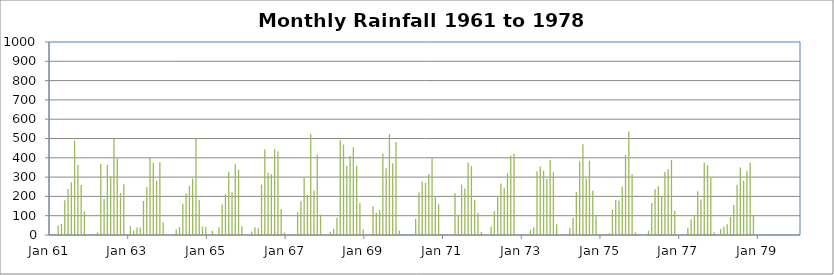
| Category | Monthly Rainfall |
|---|---|
| 1921-01-31 | 0 |
| 1921-02-28 | 0 |
| 1921-03-31 | 140.5 |
| 1921-04-30 | 119.6 |
| 1921-05-31 | 381.8 |
| 1921-06-30 | 167.4 |
| 1921-07-31 | 311.7 |
| 1921-08-31 | 283.7 |
| 1921-09-30 | 272.5 |
| 1921-10-31 | 304.5 |
| 1921-11-30 | 108.5 |
| 1921-12-31 | 76.2 |
| 1922-01-31 | 0 |
| 1922-02-28 | 0 |
| 1922-03-31 | 45.7 |
| 1922-04-30 | 85.1 |
| 1922-05-31 | 345.4 |
| 1922-06-30 | 569.2 |
| 1922-07-31 | 336.5 |
| 1922-08-31 | 350.5 |
| 1922-09-30 | 463 |
| 1922-10-31 | 261.1 |
| 1922-11-30 | 127 |
| 1922-12-31 | 52.1 |
| 1923-01-31 | 0 |
| 1923-02-28 | 0 |
| 1923-03-31 | 76.2 |
| 1923-04-30 | 122.7 |
| 1923-05-31 | 138.2 |
| 1923-06-30 | 397.5 |
| 1923-07-31 | 357.6 |
| 1923-08-31 | 302.3 |
| 1923-09-30 | 463.3 |
| 1923-10-31 | 325.9 |
| 1923-11-30 | 277.1 |
| 1923-12-31 | 39.6 |
| 1924-01-31 | 8.1 |
| 1924-02-29 | 72.4 |
| 1924-03-31 | 7.9 |
| 1924-04-30 | 55.9 |
| 1924-05-31 | 238.5 |
| 1924-06-30 | 350.5 |
| 1924-07-31 | 320.3 |
| 1924-08-31 | 378.7 |
| 1924-09-30 | 434.3 |
| 1924-10-31 | 290.1 |
| 1924-11-30 | 180.1 |
| 1924-12-31 | 0 |
| 1925-01-31 | 0 |
| 1925-02-28 | 19.6 |
| 1925-03-31 | 99.3 |
| 1925-04-30 | 37.1 |
| 1925-05-31 | 230.6 |
| 1925-06-30 | 401.1 |
| 1925-07-31 | 271 |
| 1925-08-31 | 284.7 |
| 1925-09-30 | 363.5 |
| 1925-10-31 | 458 |
| 1925-11-30 | 146.3 |
| 1925-12-31 | 27.4 |
| 1926-01-31 | 2.8 |
| 1926-02-28 | 0 |
| 1926-03-31 | 29.7 |
| 1926-04-30 | 42.2 |
| 1926-05-31 | 157.2 |
| 1926-06-30 | 255.3 |
| 1926-07-31 | 347.5 |
| 1926-08-31 | 441.5 |
| 1926-09-30 | 481.8 |
| 1926-10-31 | 265.4 |
| 1926-11-30 | 146.3 |
| 1926-12-31 | 10.2 |
| 1927-01-31 | 0 |
| 1927-02-28 | 2.8 |
| 1927-03-31 | 19.8 |
| 1927-04-30 | 113.8 |
| 1927-05-31 | 272.5 |
| 1927-06-30 | 364 |
| 1927-07-31 | 229.9 |
| 1927-08-31 | 204.5 |
| 1927-09-30 | 531.6 |
| 1927-10-31 | 509.5 |
| 1927-11-30 | 26.7 |
| 1927-12-31 | 9.7 |
| 1928-01-31 | 8.9 |
| 1928-02-29 | 0 |
| 1928-03-31 | 54.6 |
| 1928-04-30 | 232.9 |
| 1928-05-31 | 168.4 |
| 1928-06-30 | 184.4 |
| 1928-07-31 | 496.6 |
| 1928-08-31 | 366 |
| 1928-09-30 | 399.8 |
| 1928-10-31 | 527.8 |
| 1928-11-30 | 53.8 |
| 1928-12-31 | 16.8 |
| 1929-01-31 | 0 |
| 1929-02-28 | 0 |
| 1929-03-31 | 112.8 |
| 1929-04-30 | 110.5 |
| 1929-05-31 | 167.9 |
| 1929-06-30 | 305.3 |
| 1929-07-31 | 237.7 |
| 1929-08-31 | 353.3 |
| 1929-09-30 | 371.3 |
| 1929-10-31 | 319.8 |
| 1929-11-30 | 9.9 |
| 1929-12-31 | 0 |
| 1930-01-31 | 31 |
| 1930-02-28 | 61 |
| 1930-03-31 | 17.8 |
| 1930-04-30 | 45 |
| 1930-05-31 | 180.3 |
| 1930-06-30 | 252.7 |
| 1930-07-31 | 388.6 |
| 1930-08-31 | 316.5 |
| 1930-09-30 | 422.7 |
| 1930-10-31 | 287 |
| 1930-11-30 | 38.4 |
| 1930-12-31 | 17 |
| 1931-01-31 | 37.3 |
| 1931-02-28 | 0 |
| 1931-03-31 | 61 |
| 1931-04-30 | 177.8 |
| 1931-05-31 | 184.9 |
| 1931-06-30 | 418.3 |
| 1931-07-31 | 386.1 |
| 1931-08-31 | 289.3 |
| 1931-09-30 | 294.4 |
| 1931-10-31 | 289.1 |
| 1931-11-30 | 93 |
| 1931-12-31 | 10.9 |
| 1932-01-31 | 0 |
| 1932-02-29 | 29.5 |
| 1932-03-31 | 124 |
| 1932-04-30 | 194.1 |
| 1932-05-31 | 164.3 |
| 1932-06-30 | 410.2 |
| 1932-07-31 | 385.3 |
| 1932-08-31 | 422.1 |
| 1932-09-30 | 308.4 |
| 1932-10-31 | 355.9 |
| 1932-11-30 | 241.6 |
| 1932-12-31 | 0 |
| 1933-01-31 | 1 |
| 1933-02-28 | 87.6 |
| 1933-03-31 | 23.4 |
| 1933-04-30 | 96 |
| 1933-05-31 | 198.4 |
| 1933-06-30 | 358.6 |
| 1933-07-31 | 385.8 |
| 1933-08-31 | 644.1 |
| 1933-09-30 | 308.4 |
| 1933-10-31 | 172 |
| 1933-11-30 | 120.9 |
| 1933-12-31 | 33.8 |
| 1934-01-31 | 0 |
| 1934-02-28 | 39.1 |
| 1934-03-31 | 57.4 |
| 1934-04-30 | 48.5 |
| 1934-05-31 | 35.8 |
| 1934-06-30 | 322.1 |
| 1934-07-31 | 328.2 |
| 1934-08-31 | 442.7 |
| 1934-09-30 | 553.5 |
| 1934-10-31 | 508.3 |
| 1934-11-30 | 37.4 |
| 1934-12-31 | 1 |
| 1935-01-31 | 17.3 |
| 1935-02-28 | 1 |
| 1935-03-31 | 1.8 |
| 1935-04-30 | 34.3 |
| 1935-05-31 | 185.7 |
| 1935-06-30 | 428.2 |
| 1935-07-31 | 351.5 |
| 1935-08-31 | 245.1 |
| 1935-09-30 | 330.7 |
| 1935-10-31 | 254.5 |
| 1935-11-30 | 106.4 |
| 1935-12-31 | 53.1 |
| 1936-01-31 | 5.6 |
| 1936-02-29 | 9.4 |
| 1936-03-31 | 47.2 |
| 1936-04-30 | 90.9 |
| 1936-05-31 | 233.7 |
| 1936-06-30 | 278.9 |
| 1936-07-31 | 309.6 |
| 1936-08-31 | 351 |
| 1936-09-30 | 392.9 |
| 1936-10-31 | 326.9 |
| 1936-11-30 | 91.2 |
| 1936-12-31 | 16.3 |
| 1937-01-31 | 0 |
| 1937-02-28 | 0 |
| 1937-03-31 | 112 |
| 1937-04-30 | 158.2 |
| 1937-05-31 | 217.9 |
| 1937-06-30 | 402.6 |
| 1937-07-31 | 159.5 |
| 1937-08-31 | 442.7 |
| 1937-09-30 | 390.1 |
| 1937-10-31 | 470.9 |
| 1937-11-30 | 32.5 |
| 1937-12-31 | 1 |
| 1938-01-31 | 0 |
| 1938-02-28 | 3.3 |
| 1938-03-31 | 91.2 |
| 1938-04-30 | 103.6 |
| 1938-05-31 | 201.4 |
| 1938-06-30 | 297.4 |
| 1938-07-31 | 437.9 |
| 1938-08-31 | 452.9 |
| 1938-09-30 | 405.1 |
| 1938-10-31 | 368.8 |
| 1938-11-30 | 87.1 |
| 1938-12-31 | 0 |
| 1939-01-31 | 7.6 |
| 1939-02-28 | 0 |
| 1939-03-31 | 19.8 |
| 1939-04-30 | 74.4 |
| 1939-05-31 | 171.7 |
| 1939-06-30 | 349.8 |
| 1939-07-31 | 347.5 |
| 1939-08-31 | 398.5 |
| 1939-09-30 | 366.3 |
| 1939-10-31 | 342.6 |
| 1939-11-30 | 88.4 |
| 1939-12-31 | 5.1 |
| 1940-01-31 | 0 |
| 1940-02-29 | 0 |
| 1940-03-31 | 50.8 |
| 1940-04-30 | 46.7 |
| 1940-05-31 | 212.1 |
| 1940-06-30 | 415 |
| 1940-07-31 | 313.2 |
| 1940-08-31 | 289.1 |
| 1940-09-30 | 429.3 |
| 1940-10-31 | 426.7 |
| 1940-11-30 | 106.4 |
| 1940-12-31 | 0 |
| 1941-01-31 | 1.8 |
| 1941-02-28 | 0 |
| 1941-03-31 | 27.4 |
| 1941-04-30 | 65.3 |
| 1941-05-31 | 196.8 |
| 1941-06-30 | 258.6 |
| 1941-07-31 | 384.6 |
| 1941-08-31 | 409.2 |
| 1941-09-30 | 504.4 |
| 1941-10-31 | 243.3 |
| 1941-11-30 | 194.3 |
| 1941-12-31 | 2 |
| 1942-01-31 | 0.8 |
| 1942-02-28 | 0 |
| 1942-03-31 | 7.6 |
| 1942-04-30 | 189.7 |
| 1942-05-31 | 281.7 |
| 1942-06-30 | 222.2 |
| 1942-07-31 | 289.1 |
| 1942-08-31 | 315.7 |
| 1942-09-30 | 281.7 |
| 1942-10-31 | 337.8 |
| 1942-11-30 | 178.1 |
| 1942-12-31 | 19.3 |
| 1943-01-31 | 6.3 |
| 1943-02-28 | 14.2 |
| 1943-03-31 | 55.1 |
| 1943-04-30 | 143 |
| 1943-05-31 | 175 |
| 1943-06-30 | 315 |
| 1943-07-31 | 304.3 |
| 1943-08-31 | 358.1 |
| 1943-09-30 | 401.8 |
| 1943-10-31 | 386.1 |
| 1943-11-30 | 62.7 |
| 1943-12-31 | 17.8 |
| 1944-01-31 | 11.2 |
| 1944-02-29 | 7.4 |
| 1944-03-31 | 36.3 |
| 1944-04-30 | 77.7 |
| 1944-05-31 | 223 |
| 1944-06-30 | 305.6 |
| 1944-07-31 | 310.4 |
| 1944-08-31 | 363.7 |
| 1944-09-30 | 414 |
| 1944-10-31 | 299 |
| 1944-11-30 | 53.1 |
| 1944-12-31 | 3.8 |
| 1945-01-31 | 5.8 |
| 1945-02-28 | 5.3 |
| 1945-03-31 | 37.3 |
| 1945-04-30 | 157 |
| 1945-05-31 | 189.2 |
| 1945-06-30 | 313.4 |
| 1945-07-31 | 308.4 |
| 1945-08-31 | 402.1 |
| 1945-09-30 | 396.2 |
| 1945-10-31 | 307.1 |
| 1945-11-30 | 116.6 |
| 1945-12-31 | 12.7 |
| 1946-01-31 | 9.4 |
| 1946-02-28 | 3 |
| 1946-03-31 | 38.4 |
| 1946-04-30 | 119.6 |
| 1946-05-31 | 188.5 |
| 1946-06-30 | 279.1 |
| 1946-07-31 | 310.1 |
| 1946-08-31 | 401.8 |
| 1946-09-30 | 371.6 |
| 1946-10-31 | 347.5 |
| 1946-11-30 | 79 |
| 1946-12-31 | 25.9 |
| 1947-01-31 | 5.6 |
| 1947-02-28 | 13.7 |
| 1947-03-31 | 58.2 |
| 1947-04-30 | 63.2 |
| 1947-05-31 | 181.1 |
| 1947-06-30 | 311.1 |
| 1947-07-31 | 305.8 |
| 1947-08-31 | 379 |
| 1947-09-30 | 389.9 |
| 1947-10-31 | 306.8 |
| 1947-11-30 | 17.8 |
| 1947-12-31 | 5.8 |
| 1948-01-31 | 5.6 |
| 1948-02-29 | 8.4 |
| 1948-03-31 | 32.3 |
| 1948-04-30 | 82 |
| 1948-05-31 | 228.1 |
| 1948-06-30 | 289.1 |
| 1948-07-31 | 304.3 |
| 1948-08-31 | 386.8 |
| 1948-09-30 | 438.4 |
| 1948-10-31 | 309.1 |
| 1948-11-30 | 46.2 |
| 1948-12-31 | 4.3 |
| 1949-01-31 | 0 |
| 1949-02-28 | 0 |
| 1949-03-31 | 17.8 |
| 1949-04-30 | 123.4 |
| 1949-05-31 | 192.3 |
| 1949-06-30 | 167.4 |
| 1949-07-31 | 276.6 |
| 1949-08-31 | 316.5 |
| 1949-09-30 | 411 |
| 1949-10-31 | 280.4 |
| 1949-11-30 | 53.1 |
| 1949-12-31 | 5.1 |
| 1950-01-31 | 0 |
| 1950-02-28 | 0 |
| 1950-03-31 | 48.5 |
| 1950-04-30 | 25.7 |
| 1950-05-31 | 120.4 |
| 1950-06-30 | 360.4 |
| 1950-07-31 | 249.4 |
| 1950-08-31 | 289.8 |
| 1950-09-30 | 360.7 |
| 1950-10-31 | 264.7 |
| 1950-11-30 | 58.4 |
| 1950-12-31 | 0 |
| 1951-01-31 | 31.7 |
| 1951-02-28 | 31.7 |
| 1951-03-31 | 146.8 |
| 1951-04-30 | 39.9 |
| 1951-05-31 | 272.8 |
| 1951-06-30 | 386.1 |
| 1951-07-31 | 390.9 |
| 1951-08-31 | 450.3 |
| 1951-09-30 | 514.6 |
| 1951-10-31 | 452.4 |
| 1951-11-30 | 135.4 |
| 1951-12-31 | 0 |
| 1952-01-31 | 0 |
| 1952-02-29 | 34.5 |
| 1952-03-31 | 32.8 |
| 1952-04-30 | 23.9 |
| 1952-05-31 | 191.8 |
| 1952-06-30 | 263.4 |
| 1952-07-31 | 275.3 |
| 1952-08-31 | 331.5 |
| 1952-09-30 | 433.6 |
| 1952-10-31 | 163.3 |
| 1952-11-30 | 132.8 |
| 1952-12-31 | 15.7 |
| 1953-01-31 | 2.5 |
| 1953-02-28 | 0 |
| 1953-03-31 | 151.9 |
| 1953-04-30 | 59.9 |
| 1953-05-31 | 111.5 |
| 1953-06-30 | 435.9 |
| 1953-07-31 | 402.1 |
| 1953-08-31 | 563.4 |
| 1953-09-30 | 387.9 |
| 1953-10-31 | 319.8 |
| 1953-11-30 | 67.6 |
| 1953-12-31 | 97.3 |
| 1954-01-31 | 0 |
| 1954-02-28 | 21.6 |
| 1954-03-31 | 30.7 |
| 1954-04-30 | 116.6 |
| 1954-05-31 | 153.2 |
| 1954-06-30 | 238.8 |
| 1954-07-31 | 372.1 |
| 1954-08-31 | 490.7 |
| 1954-09-30 | 387.9 |
| 1954-10-31 | 382.8 |
| 1954-11-30 | 254.5 |
| 1954-12-31 | 63.5 |
| 1955-01-31 | 17 |
| 1955-02-28 | 5.6 |
| 1955-03-31 | 129 |
| 1955-04-30 | 203.5 |
| 1955-05-31 | 181.4 |
| 1955-06-30 | 357.9 |
| 1955-07-31 | 400.3 |
| 1955-08-31 | 382.5 |
| 1955-09-30 | 500.1 |
| 1955-10-31 | 464.6 |
| 1955-11-30 | 68.8 |
| 1955-12-31 | 15.2 |
| 1956-01-31 | 0 |
| 1956-02-29 | 38.1 |
| 1956-03-31 | 14 |
| 1956-04-30 | 65.3 |
| 1956-05-31 | 175 |
| 1956-06-30 | 341.4 |
| 1956-07-31 | 252 |
| 1956-08-31 | 369.3 |
| 1956-09-30 | 425.2 |
| 1956-10-31 | 165.9 |
| 1956-11-30 | 88.9 |
| 1956-12-31 | 56.4 |
| 1957-01-31 | 0 |
| 1957-02-28 | 3 |
| 1957-03-31 | 20.3 |
| 1957-04-30 | 175.5 |
| 1957-05-31 | 119.6 |
| 1957-06-30 | 240.5 |
| 1957-07-31 | 367.5 |
| 1957-08-31 | 290.6 |
| 1957-09-30 | 453.6 |
| 1957-10-31 | 400.3 |
| 1957-11-30 | 112 |
| 1957-12-31 | 0 |
| 1958-01-31 | 136.7 |
| 1958-02-28 | 14.7 |
| 1958-03-31 | 98 |
| 1958-04-30 | 187.2 |
| 1958-05-31 | 336.3 |
| 1958-06-30 | 211.3 |
| 1958-07-31 | 121.4 |
| 1958-08-31 | 390.4 |
| 1958-09-30 | 375.7 |
| 1958-10-31 | 498.6 |
| 1958-11-30 | 247.9 |
| 1958-12-31 | 58.4 |
| 1959-01-31 | 1 |
| 1959-02-28 | 3.8 |
| 1959-03-31 | 13 |
| 1959-04-30 | 95.2 |
| 1959-05-31 | 231.6 |
| 1959-06-30 | 309.1 |
| 1959-07-31 | 239.8 |
| 1959-08-31 | 332 |
| 1959-09-30 | 401.8 |
| 1959-10-31 | 212.1 |
| 1959-11-30 | 150.6 |
| 1959-12-31 | 0 |
| 1960-01-31 | 0 |
| 1960-02-29 | 9.4 |
| 1960-03-31 | 1 |
| 1960-04-30 | 84.1 |
| 1960-05-31 | 196.6 |
| 1960-06-30 | 368.3 |
| 1960-07-31 | 322.8 |
| 1960-08-31 | 295.4 |
| 1960-09-30 | 319.5 |
| 1960-10-31 | 509.3 |
| 1960-11-30 | 35.3 |
| 1960-12-31 | 10.7 |
| 1961-01-31 | 0 |
| 1961-02-28 | 5.6 |
| 1961-03-31 | 49.5 |
| 1961-04-30 | 56.9 |
| 1961-05-31 | 180.3 |
| 1961-06-30 | 238.5 |
| 1961-07-31 | 273.8 |
| 1961-08-31 | 489.5 |
| 1961-09-30 | 362.5 |
| 1961-10-31 | 258.6 |
| 1961-11-30 | 122.4 |
| 1961-12-31 | 0 |
| 1962-01-31 | 0 |
| 1962-02-28 | 0 |
| 1962-03-31 | 13.7 |
| 1962-04-30 | 367.8 |
| 1962-05-31 | 188 |
| 1962-06-30 | 363.5 |
| 1962-07-31 | 304 |
| 1962-08-31 | 497.3 |
| 1962-09-30 | 396.5 |
| 1962-10-31 | 216.9 |
| 1962-11-30 | 263.4 |
| 1962-12-31 | 0 |
| 1963-01-31 | 46.5 |
| 1963-02-28 | 23.4 |
| 1963-03-31 | 39.4 |
| 1963-04-30 | 39.4 |
| 1963-05-31 | 175.8 |
| 1963-06-30 | 249.2 |
| 1963-07-31 | 399.3 |
| 1963-08-31 | 373.1 |
| 1963-09-30 | 281.7 |
| 1963-10-31 | 376.4 |
| 1963-11-30 | 64.6 |
| 1963-12-31 | 0 |
| 1964-01-31 | 0 |
| 1964-02-29 | 0 |
| 1964-03-31 | 28.4 |
| 1964-04-30 | 40.6 |
| 1964-05-31 | 161.5 |
| 1964-06-30 | 214.9 |
| 1964-07-31 | 253.7 |
| 1964-08-31 | 292.9 |
| 1964-09-30 | 497.1 |
| 1964-10-31 | 182.1 |
| 1964-11-30 | 43.7 |
| 1964-12-31 | 41.4 |
| 1965-01-31 | 0.8 |
| 1965-02-28 | 21.6 |
| 1965-03-31 | 0 |
| 1965-04-30 | 40.4 |
| 1965-05-31 | 158.2 |
| 1965-06-30 | 212.1 |
| 1965-07-31 | 328.2 |
| 1965-08-31 | 221.2 |
| 1965-09-30 | 366.8 |
| 1965-10-31 | 338.6 |
| 1965-11-30 | 45 |
| 1965-12-31 | 0 |
| 1966-01-31 | 0 |
| 1966-02-28 | 18 |
| 1966-03-31 | 40.4 |
| 1966-04-30 | 34.9 |
| 1966-05-31 | 261.4 |
| 1966-06-30 | 443 |
| 1966-07-31 | 322.1 |
| 1966-08-31 | 315.7 |
| 1966-09-30 | 444.5 |
| 1966-10-31 | 432.1 |
| 1966-11-30 | 135.1 |
| 1966-12-31 | 13.5 |
| 1967-01-31 | 0 |
| 1967-02-28 | 0 |
| 1967-03-31 | 1.8 |
| 1967-04-30 | 117.9 |
| 1967-05-31 | 175.5 |
| 1967-06-30 | 295.7 |
| 1967-07-31 | 208 |
| 1967-08-31 | 521.7 |
| 1967-09-30 | 230.1 |
| 1967-10-31 | 416.8 |
| 1967-11-30 | 105.7 |
| 1967-12-31 | 0 |
| 1968-01-31 | 0 |
| 1968-02-29 | 16.8 |
| 1968-03-31 | 30.7 |
| 1968-04-30 | 89.2 |
| 1968-05-31 | 491 |
| 1968-06-30 | 468.9 |
| 1968-07-31 | 357.6 |
| 1968-08-31 | 409.7 |
| 1968-09-30 | 454.2 |
| 1968-10-31 | 358.6 |
| 1968-11-30 | 165.1 |
| 1968-12-31 | 29.5 |
| 1969-01-31 | 5.1 |
| 1969-02-28 | 2 |
| 1969-03-31 | 149.4 |
| 1969-04-30 | 115.3 |
| 1969-05-31 | 128.8 |
| 1969-06-30 | 420.6 |
| 1969-07-31 | 346.2 |
| 1969-08-31 | 524.3 |
| 1969-09-30 | 372.1 |
| 1969-10-31 | 482.1 |
| 1969-11-30 | 23.6 |
| 1969-12-31 | 0 |
| 1970-01-31 | 0 |
| 1970-02-28 | 0 |
| 1970-03-31 | 0.8 |
| 1970-04-30 | 84.1 |
| 1970-05-31 | 220 |
| 1970-06-30 | 277.4 |
| 1970-07-31 | 270 |
| 1970-08-31 | 316.7 |
| 1970-09-30 | 401.1 |
| 1970-10-31 | 201.9 |
| 1970-11-30 | 159.3 |
| 1970-12-31 | 0 |
| 1971-01-31 | 0 |
| 1971-02-28 | 0 |
| 1971-03-31 | 0 |
| 1971-04-30 | 216.4 |
| 1971-05-31 | 104.4 |
| 1971-06-30 | 260.9 |
| 1971-07-31 | 241.3 |
| 1971-08-31 | 374.4 |
| 1971-09-30 | 356.9 |
| 1971-10-31 | 182.1 |
| 1971-11-30 | 114.6 |
| 1971-12-31 | 15 |
| 1972-01-31 | 0 |
| 1972-02-29 | 0 |
| 1972-03-31 | 42.2 |
| 1972-04-30 | 123.2 |
| 1972-05-31 | 201.9 |
| 1972-06-30 | 267.2 |
| 1972-07-31 | 245.1 |
| 1972-08-31 | 320 |
| 1972-09-30 | 410 |
| 1972-10-31 | 419.6 |
| 1972-11-30 | 2.5 |
| 1972-12-31 | 0 |
| 1973-01-31 | 0 |
| 1973-02-28 | 0 |
| 1973-03-31 | 26.7 |
| 1973-04-30 | 38.4 |
| 1973-05-31 | 328.7 |
| 1973-06-30 | 355.1 |
| 1973-07-31 | 334 |
| 1973-08-31 | 290.8 |
| 1973-09-30 | 388.6 |
| 1973-10-31 | 325.4 |
| 1973-11-30 | 55.6 |
| 1973-12-31 | 0 |
| 1974-01-31 | 0 |
| 1974-02-28 | 0 |
| 1974-03-31 | 36.1 |
| 1974-04-30 | 88.9 |
| 1974-05-31 | 223 |
| 1974-06-30 | 381.5 |
| 1974-07-31 | 469.9 |
| 1974-08-31 | 292.9 |
| 1974-09-30 | 385.3 |
| 1974-10-31 | 229.9 |
| 1974-11-30 | 97 |
| 1974-12-31 | 0 |
| 1975-01-31 | 0 |
| 1975-02-28 | 0 |
| 1975-03-31 | 8.6 |
| 1975-04-30 | 131.3 |
| 1975-05-31 | 181.9 |
| 1975-06-30 | 177.5 |
| 1975-07-31 | 251.5 |
| 1975-08-31 | 415.3 |
| 1975-09-30 | 536.2 |
| 1975-10-31 | 314.2 |
| 1975-11-30 | 13.5 |
| 1975-12-31 | 1.5 |
| 1976-01-31 | 2.3 |
| 1976-02-29 | 0 |
| 1976-03-31 | 22.1 |
| 1976-04-30 | 165.6 |
| 1976-05-31 | 236.5 |
| 1976-06-30 | 253.2 |
| 1976-07-31 | 201.7 |
| 1976-08-31 | 326.9 |
| 1976-09-30 | 340.6 |
| 1976-10-31 | 388.6 |
| 1976-11-30 | 124.7 |
| 1976-12-31 | 0 |
| 1977-01-31 | 0 |
| 1977-02-28 | 0 |
| 1977-03-31 | 38.1 |
| 1977-04-30 | 81.8 |
| 1977-05-31 | 99.1 |
| 1977-06-30 | 227.1 |
| 1977-07-31 | 183.6 |
| 1977-08-31 | 374.6 |
| 1977-09-30 | 361.7 |
| 1977-10-31 | 296.4 |
| 1977-11-30 | 14.7 |
| 1977-12-31 | 0.8 |
| 1978-01-31 | 31 |
| 1978-02-28 | 43.9 |
| 1978-03-31 | 55.1 |
| 1978-04-30 | 94.2 |
| 1978-05-31 | 155.4 |
| 1978-06-30 | 260.6 |
| 1978-07-31 | 350.3 |
| 1978-08-31 | 281.2 |
| 1978-09-30 | 332 |
| 1978-10-31 | 374.9 |
| 1978-11-30 | 101.3 |